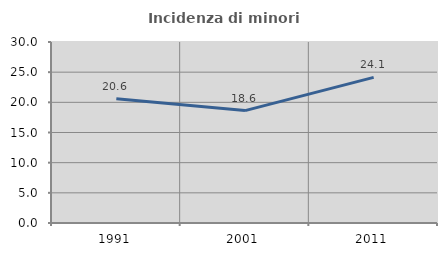
| Category | Incidenza di minori stranieri |
|---|---|
| 1991.0 | 20.588 |
| 2001.0 | 18.627 |
| 2011.0 | 24.132 |